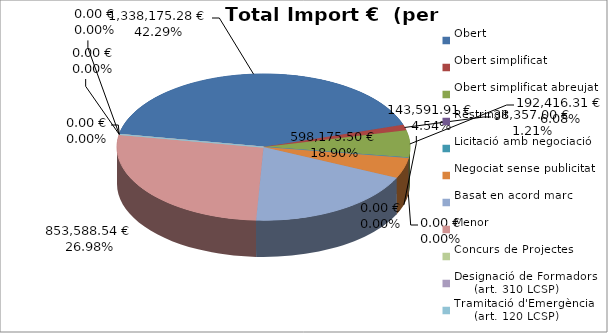
| Category | Total preu
(amb IVA) |
|---|---|
| Obert | 1338175.28 |
| Obert simplificat | 38357 |
| Obert simplificat abreujat | 192416.314 |
| Restringit | 0 |
| Licitació amb negociació | 0 |
| Negociat sense publicitat | 143591.91 |
| Basat en acord marc | 598175.502 |
| Menor | 853588.54 |
| Concurs de Projectes | 0 |
| Designació de Formadors
     (art. 310 LCSP) | 0 |
| Tramitació d'Emergència
     (art. 120 LCSP) | 0 |